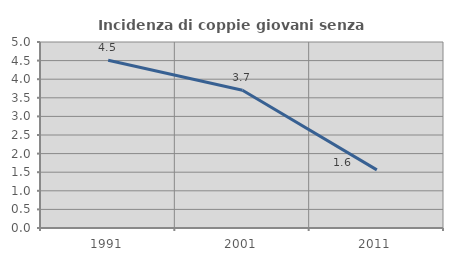
| Category | Incidenza di coppie giovani senza figli |
|---|---|
| 1991.0 | 4.511 |
| 2001.0 | 3.704 |
| 2011.0 | 1.562 |